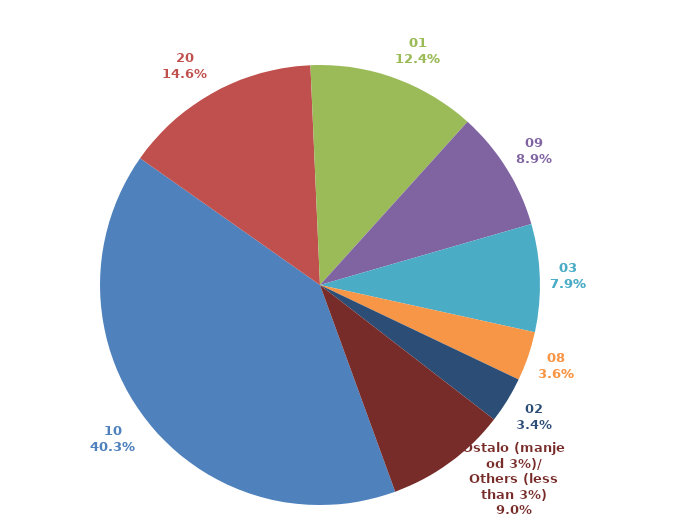
| Category | Series 0 |
|---|---|
| 10 | 0.403 |
| 20 | 0.145 |
| 01 | 0.124 |
| 09 | 0.088 |
| 03 | 0.079 |
| 08 | 0.036 |
| 02 | 0.034 |
| Ostalo (manje od 3%)/
Others (less than 3%) | 0.09 |